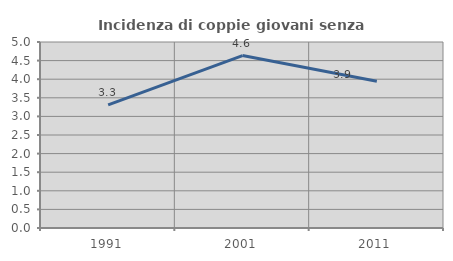
| Category | Incidenza di coppie giovani senza figli |
|---|---|
| 1991.0 | 3.311 |
| 2001.0 | 4.636 |
| 2011.0 | 3.947 |